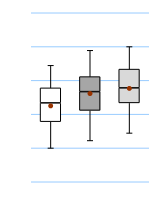
| Category | 25th | 50th | 75th |
|---|---|---|---|
| UK | 44.444 | 13.889 | 11.111 |
| Top 50% | 52.778 | 13.889 | 11.111 |
| Top 10% | 58.333 | 11.111 | 13.889 |